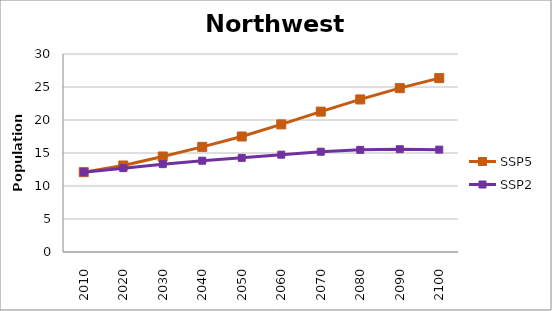
| Category | SSP5 | SSP2 |
|---|---|---|
| 2010.0 | 12100240 | 12100240 |
| 2020.0 | 13109809 | 12704074 |
| 2030.0 | 14473395 | 13310583 |
| 2040.0 | 15930496 | 13829760 |
| 2050.0 | 17500220 | 14262053 |
| 2060.0 | 19337445 | 14746141 |
| 2070.0 | 21267778 | 15194223 |
| 2080.0 | 23115714 | 15474890 |
| 2090.0 | 24823830 | 15576435 |
| 2100.0 | 26346896 | 15508570 |